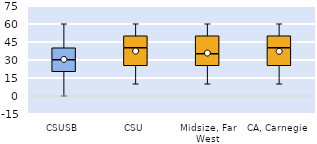
| Category | 25th | 50th | 75th |
|---|---|---|---|
| CSUSB | 20 | 10 | 10 |
| CSU | 25 | 15 | 10 |
| Midsize, Far West | 25 | 10 | 15 |
| CA, Carnegie | 25 | 15 | 10 |